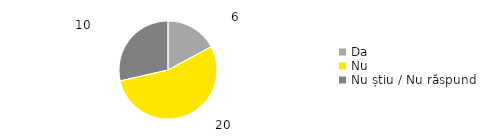
| Category | Total |
|---|---|
| Da | 0.171 |
| Nu | 0.543 |
| Nu știu / Nu răspund | 0.286 |